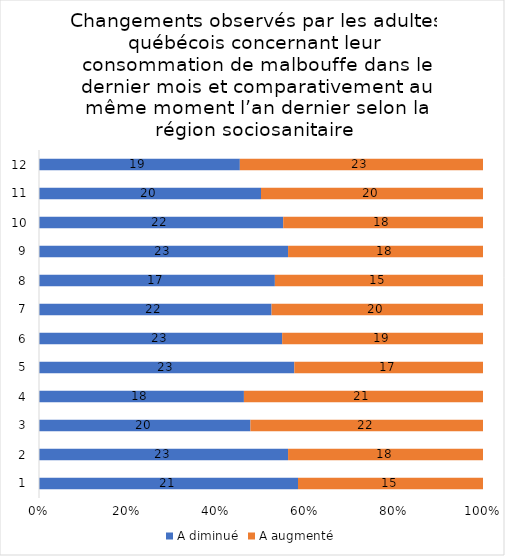
| Category | A diminué | A augmenté |
|---|---|---|
| 0 | 21 | 15 |
| 1 | 23 | 18 |
| 2 | 20 | 22 |
| 3 | 18 | 21 |
| 4 | 23 | 17 |
| 5 | 23 | 19 |
| 6 | 22 | 20 |
| 7 | 17 | 15 |
| 8 | 23 | 18 |
| 9 | 22 | 18 |
| 10 | 20 | 20 |
| 11 | 19 | 23 |